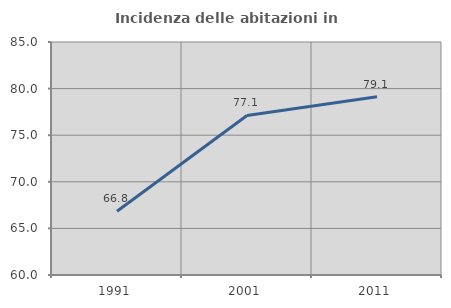
| Category | Incidenza delle abitazioni in proprietà  |
|---|---|
| 1991.0 | 66.834 |
| 2001.0 | 77.119 |
| 2011.0 | 79.124 |